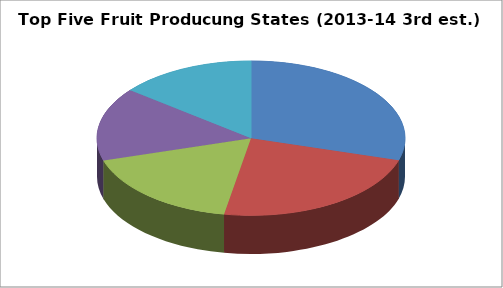
| Category | Series 0 |
|---|---|
| ANDHRA PRADESH | 16.377 |
| MAHARASHTRA | 12.822 |
| GUJARAT | 9.69 |
| TAMILNADU | 8.489 |
| UTTAR PRADESH | 7.933 |